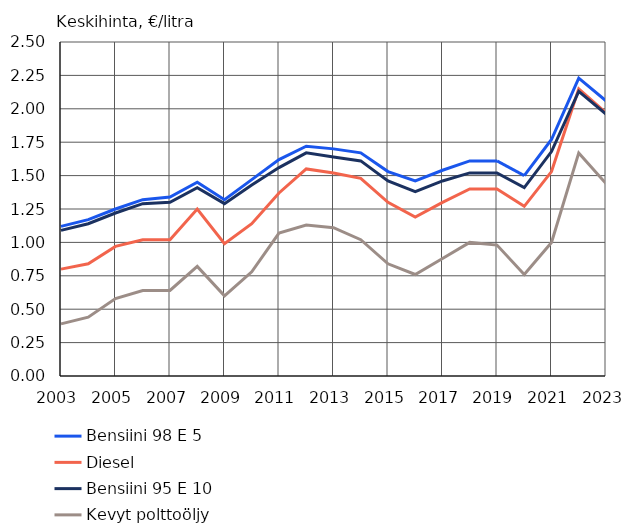
| Category | Bensiini 98 E 5 | Diesel | Bensiini 95 E 10 | Kevyt polttoöljy |
|---|---|---|---|---|
| 2003.0 | 1.12 | 0.8 | 1.09 | 0.39 |
| 2004.0 | 1.17 | 0.84 | 1.14 | 0.44 |
| 2005.0 | 1.25 | 0.97 | 1.22 | 0.58 |
| 2006.0 | 1.32 | 1.02 | 1.29 | 0.64 |
| 2007.0 | 1.34 | 1.02 | 1.3 | 0.64 |
| 2008.0 | 1.45 | 1.25 | 1.41 | 0.82 |
| 2009.0 | 1.32 | 0.99 | 1.29 | 0.6 |
| 2010.0 | 1.47 | 1.14 | 1.43 | 0.78 |
| 2011.0 | 1.62 | 1.37 | 1.56 | 1.07 |
| 2012.0 | 1.72 | 1.55 | 1.67 | 1.13 |
| 2013.0 | 1.7 | 1.52 | 1.64 | 1.11 |
| 2014.0 | 1.67 | 1.48 | 1.61 | 1.02 |
| 2015.0 | 1.53 | 1.3 | 1.46 | 0.84 |
| 2016.0 | 1.46 | 1.19 | 1.38 | 0.76 |
| 2017.0 | 1.54 | 1.3 | 1.46 | 0.88 |
| 2018.0 | 1.61 | 1.4 | 1.52 | 1 |
| 2019.0 | 1.61 | 1.4 | 1.52 | 0.98 |
| 2020.0 | 1.5 | 1.27 | 1.41 | 0.76 |
| 2021.0 | 1.77 | 1.53 | 1.68 | 1 |
| 2022.0 | 2.23 | 2.15 | 2.13 | 1.67 |
| 2023.0 | 2.06 | 1.97 | 1.96 | 1.44 |